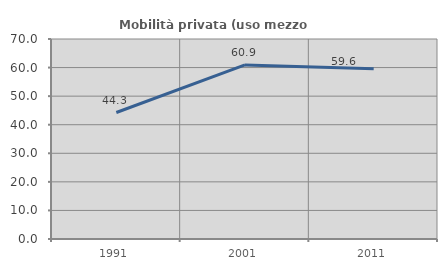
| Category | Mobilità privata (uso mezzo privato) |
|---|---|
| 1991.0 | 44.265 |
| 2001.0 | 60.941 |
| 2011.0 | 59.579 |